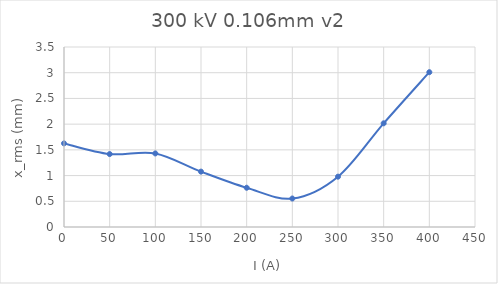
| Category | Series 0 |
|---|---|
| 0.0 | 1.626 |
| 50.0 | 1.418 |
| 100.0 | 1.43 |
| 150.0 | 1.077 |
| 200.0 | 0.763 |
| 250.0 | 0.554 |
| 300.0 | 0.979 |
| 350.0 | 2.016 |
| 400.0 | 3.01 |